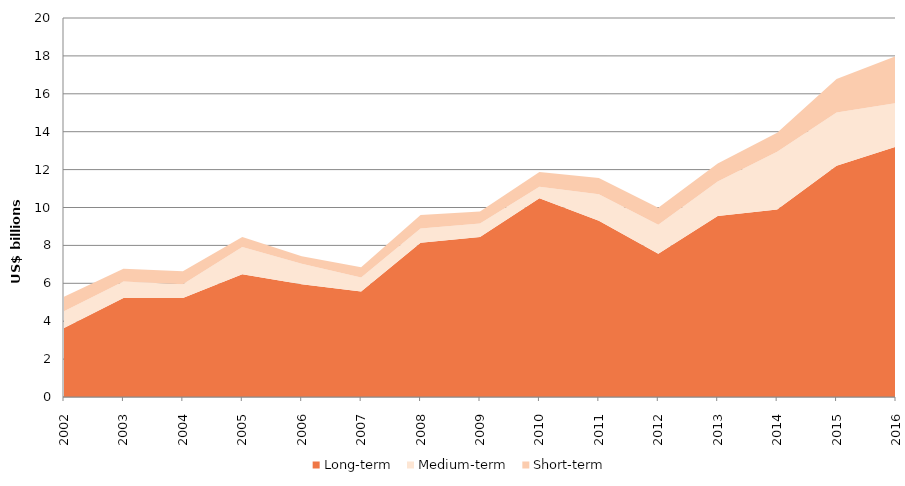
| Category | Long-term  | Medium-term  | Short-term  |
|---|---|---|---|
| 2002.0 | 3.647 | 0.873 | 0.769 |
| 2003.0 | 5.23 | 0.862 | 0.672 |
| 2004.0 | 5.219 | 0.728 | 0.694 |
| 2005.0 | 6.479 | 1.442 | 0.522 |
| 2006.0 | 5.944 | 1.085 | 0.398 |
| 2007.0 | 5.566 | 0.743 | 0.543 |
| 2008.0 | 8.136 | 0.752 | 0.72 |
| 2009.0 | 8.447 | 0.703 | 0.634 |
| 2010.0 | 10.494 | 0.606 | 0.769 |
| 2011.0 | 9.3 | 1.397 | 0.858 |
| 2012.0 | 7.564 | 1.524 | 0.899 |
| 2013.0 | 9.552 | 1.82 | 0.944 |
| 2014.0 | 9.895 | 3.053 | 1 |
| 2015.0 | 12.197 | 2.814 | 1.775 |
| 2016.0 | 13.206 | 2.303 | 2.476 |